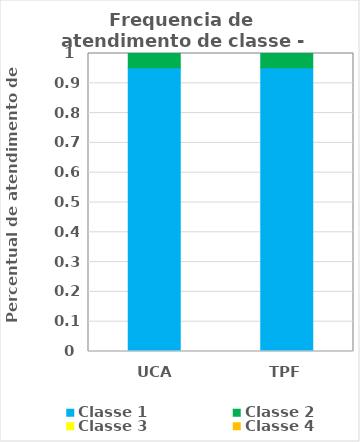
| Category | Classe 1 | Classe 2 | Classe 3 | Classe 4 |
|---|---|---|---|---|
| UCA | 0.952 | 0.048 | 0 | 0 |
| TPF | 0.952 | 0.048 | 0 | 0 |